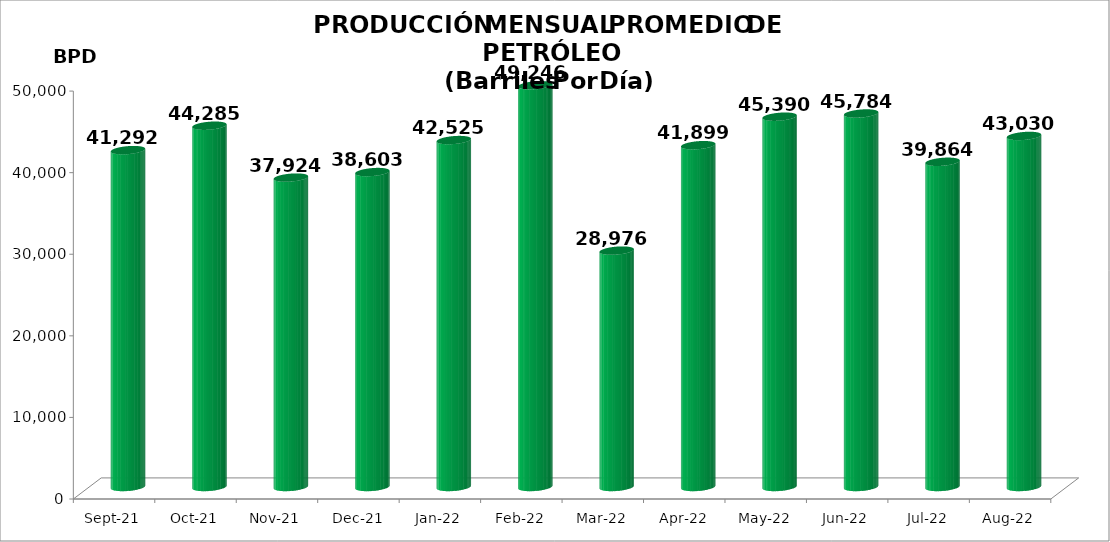
| Category | Series 0 |
|---|---|
| 2021-09-01 | 41292 |
| 2021-10-01 | 44285 |
| 2021-11-01 | 37924 |
| 2021-12-01 | 38603 |
| 2022-01-01 | 42524.516 |
| 2022-02-01 | 49246 |
| 2022-03-01 | 28976.419 |
| 2022-04-01 | 41899 |
| 2022-05-01 | 45390.387 |
| 2022-06-01 | 45784.1 |
| 2022-07-01 | 39863.677 |
| 2022-08-01 | 43030.065 |